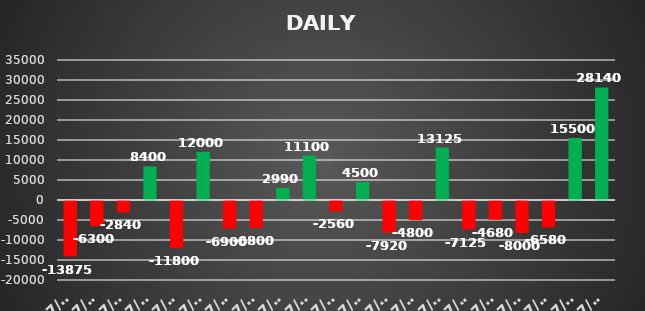
| Category | Series 0 |
|---|---|
| 2022-07-01 | -13875 |
| 2022-07-05 | -6300 |
| 2022-07-06 | -2840 |
| 2022-07-07 | 8400 |
| 2022-07-08 | -11800 |
| 2022-07-11 | 12000 |
| 2022-07-12 | -6900 |
| 2022-07-13 | -6800 |
| 2022-07-14 | 2990 |
| 2022-07-14 | 11100 |
| 2022-07-15 | -2560 |
| 2022-07-18 | 4500 |
| 2022-07-19 | -7920 |
| 2022-07-20 | -4800 |
| 2022-07-21 | 13125 |
| 2022-07-22 | -7125 |
| 2022-07-25 | -4680 |
| 2022-07-26 | -8000 |
| 2022-07-27 | -6580 |
| 2022-07-28 | 15500 |
| 2022-07-29 | 28140 |